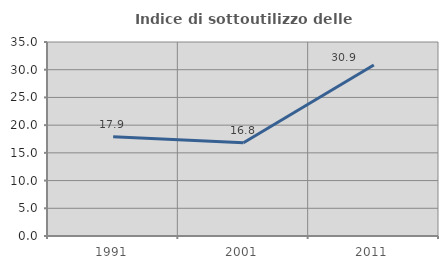
| Category | Indice di sottoutilizzo delle abitazioni  |
|---|---|
| 1991.0 | 17.923 |
| 2001.0 | 16.836 |
| 2011.0 | 30.864 |